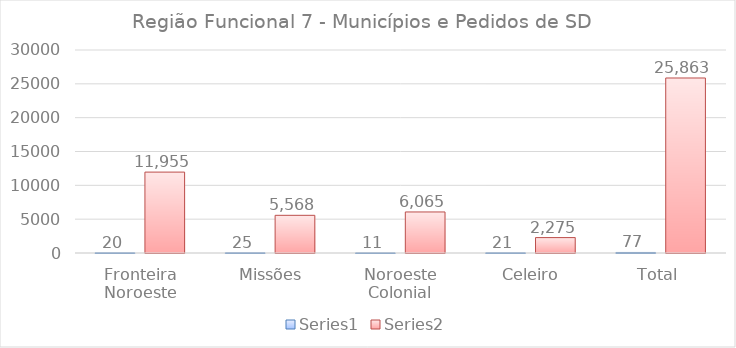
| Category | Series 0 | Series 1 |
|---|---|---|
| Fronteira Noroeste | 20 | 11955 |
|  Missões | 25 | 5568 |
| Noroeste Colonial | 11 | 6065 |
|  Celeiro | 21 | 2275 |
| Total | 77 | 25863 |